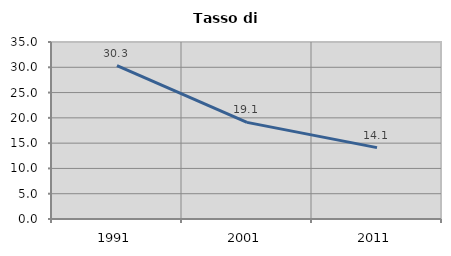
| Category | Tasso di disoccupazione   |
|---|---|
| 1991.0 | 30.316 |
| 2001.0 | 19.105 |
| 2011.0 | 14.114 |